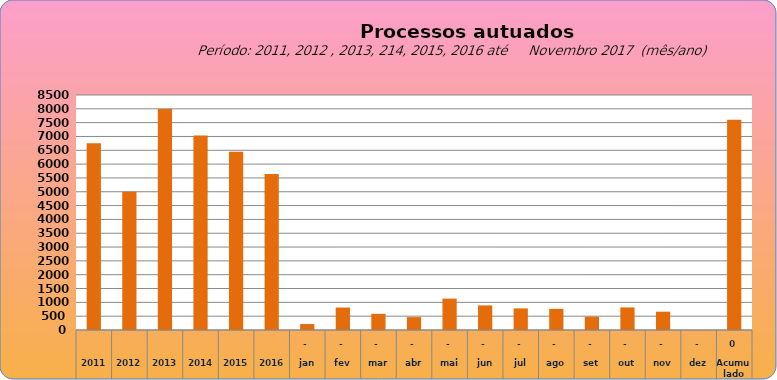
| Category | 6755 |
|---|---|
| 2011 | 6755 |
| 2012 | 4997 |
| 2013 | 7990 |
| 2014 | 7034 |
| 2015 | 6446 |
| 2016 | 5644 |
| jan | 216 |
| fev | 812 |
| mar | 586 |
| abr | 465 |
| mai | 1135 |
| jun | 889 |
| jul | 781 |
| ago | 765 |
| set | 478 |
| out | 817 |
| nov | 662 |
| dez | 0 |
| Acumulado
 | 7606 |